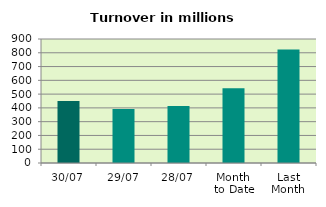
| Category | Series 0 |
|---|---|
| 30/07 | 449.521 |
| 29/07 | 392.515 |
| 28/07 | 413.967 |
| Month 
to Date | 542.77 |
| Last
Month | 824.124 |